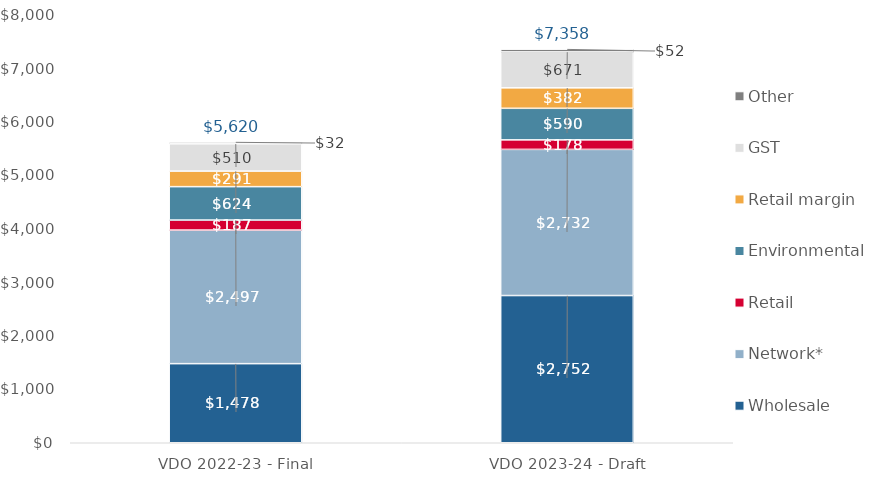
| Category | Wholesale | Network* | Retail | Environmental | Retail margin | GST | Other |
|---|---|---|---|---|---|---|---|
| VDO 2022-23 - Final | 1478.441 | 2497.075 | 187.359 | 624.191 | 290.578 | 510.146 | 32.367 |
| VDO 2023-24 - Draft | 2751.641 | 2731.788 | 177.837 | 590.127 | 382.423 | 671.392 | 51.765 |